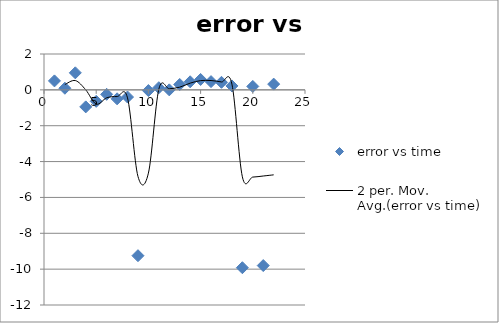
| Category | error vs time |
|---|---|
| 0 | 0.5 |
| 1 | 0.09 |
| 2 | 0.95 |
| 3 | -0.95 |
| 4 | -0.64 |
| 5 | -0.25 |
| 6 | -0.5 |
| 7 | -0.4 |
| 8 | -9.25 |
| 9 | -0.04 |
| 10 | 0.12 |
| 11 | 0 |
| 12 | 0.3 |
| 13 | 0.45 |
| 14 | 0.58 |
| 15 | 0.46 |
| 16 | 0.42 |
| 17 | 0.22 |
| 18 | -9.92 |
| 19 | 0.19 |
| 20 | -9.8 |
| 21 | 0.32 |